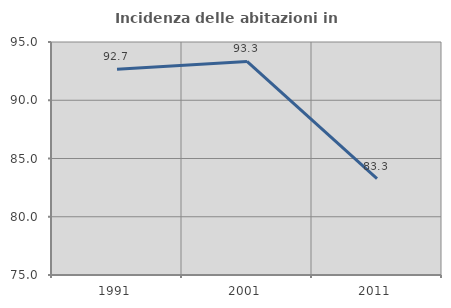
| Category | Incidenza delle abitazioni in proprietà  |
|---|---|
| 1991.0 | 92.653 |
| 2001.0 | 93.333 |
| 2011.0 | 83.267 |